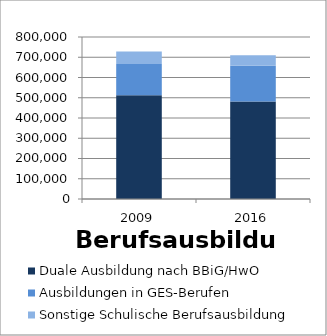
| Category | Duale Ausbildung nach BBiG/HwO | Ausbildungen in GES-Berufen | Sonstige Schulische Berufsausbildung |
|---|---|---|---|
| 2009.0 | 512518 | 153840 | 62126 |
| 2016.0 | 481423 | 176632 | 51751 |